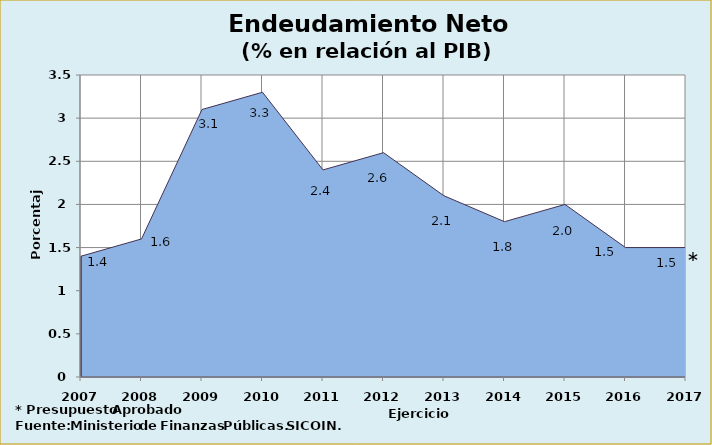
| Category | Series 0 |
|---|---|
| 2007 | 1.4 |
| 2008 | 1.6 |
| 2009 | 3.1 |
| 2010 | 3.3 |
| 2011 | 2.4 |
| 2012 | 2.6 |
| 2013 | 2.1 |
| 2014 | 1.8 |
| 2015 | 2 |
| 2016 | 1.5 |
| 2017 | 1.5 |